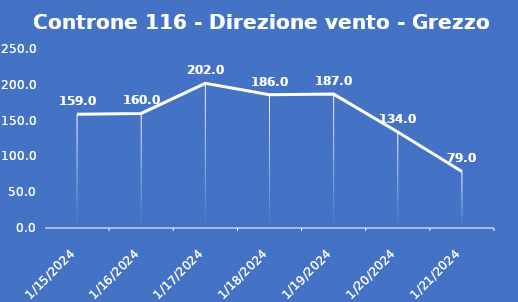
| Category | Controne 116 - Direzione vento - Grezzo (°N) |
|---|---|
| 1/15/24 | 159 |
| 1/16/24 | 160 |
| 1/17/24 | 202 |
| 1/18/24 | 186 |
| 1/19/24 | 187 |
| 1/20/24 | 134 |
| 1/21/24 | 79 |